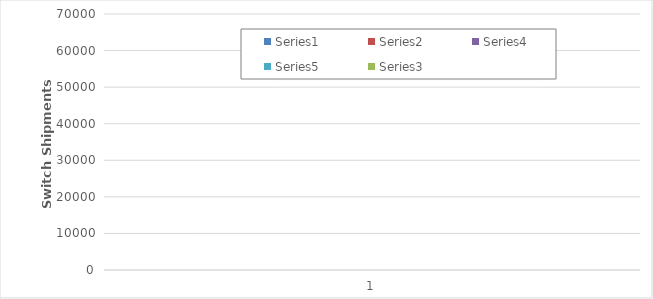
| Category | Series 0 | Series 1 | Series 3 | Series 4 | Series 2 |
|---|---|---|---|---|---|
| 0 | 1 | 1 | 1 | 1 | 1 |